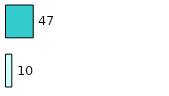
| Category | Series 0 | Series 1 |
|---|---|---|
| 0 | 10 | 47 |